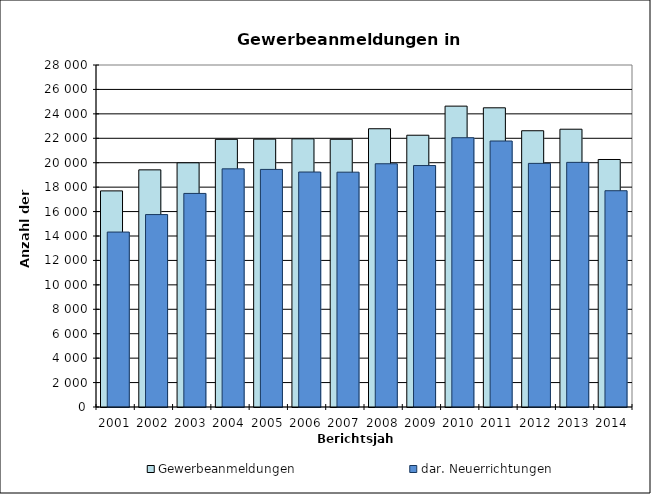
| Category | Gewerbeanmeldungen | dar. Neuerrichtungen |
|---|---|---|
| 2001.0 | 17694 | 14323 |
| 2002.0 | 19416 | 15755 |
| 2003.0 | 19992 | 17485 |
| 2004.0 | 21914 | 19499 |
| 2005.0 | 21931 | 19452 |
| 2006.0 | 21955 | 19238 |
| 2007.0 | 21918 | 19225 |
| 2008.0 | 22781 | 19914 |
| 2009.0 | 22250 | 19769 |
| 2010.0 | 24632 | 22046 |
| 2011.0 | 24495 | 21777 |
| 2012.0 | 22618 | 19945 |
| 2013.0 | 22743 | 20029 |
| 2014.0 | 20264 | 17706 |